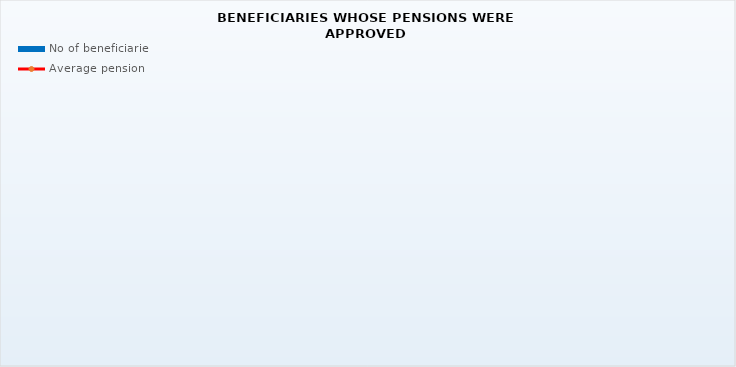
| Category | No of beneficiaries |
|---|---|
| Authorised officials in internal affairs, judicial officers and workers engaged in demining work: | 17264 |
| Active military personnel - DVO  | 15605 |
| Croatian Homeland Army veterans mobilised from 1941 to 1945 | 4314 |
| Former political prisoners | 2870 |
| Croatian Veterans from the Homeland War - ZOHBDR (Act on the Rights of Croatian Homeland War Veterans and their Family Members) | 71220 |
| Pensions approved under general regulations and determined according to the Act on the Rights of Croatian Homeland War Veterans and their Family Members (ZOHBDR), in 2017 (Art. 27, 35, 48 and 49, paragraph 2)    | 41216 |
| Former Yugoslav People's Army members - JNA   | 5589 |
| Former Yugoslav People's Army members - JNA - Art. 185 of Pension Insurance Act (ZOMO)  | 139 |
| National Liberation War veterans - NOR | 10169 |
| Members of the Croatian Parliament, members of the Government, judges of the Constitutional Court and the Auditor General | 676 |
| Members of the Parliamentary Executive Council and administratively retired federal civil servants  (relates to the former SFRY) | 96 |
| Former officials of federal bodies o the former SFRJ -  Article 38 of the Pension Insurance Act (ZOMO) | 34 |
| Full members of the Croatian Academy of Sciences and Arts - HAZU | 142 |
| Miners from the Istrian coal mines "Tupljak" d.d. Labin  | 255 |
| Workers professionally exposed to asbestos | 865 |
| Insurees - crew members on a ship in international and national navigation  - Article  129, paragraph 2 of the Maritime Code | 168 |
| Members of the Croatian Defence Council - HVO  | 6731 |